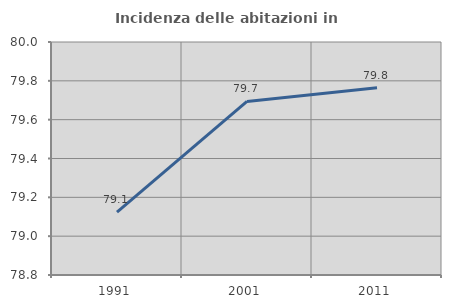
| Category | Incidenza delle abitazioni in proprietà  |
|---|---|
| 1991.0 | 79.124 |
| 2001.0 | 79.694 |
| 2011.0 | 79.764 |